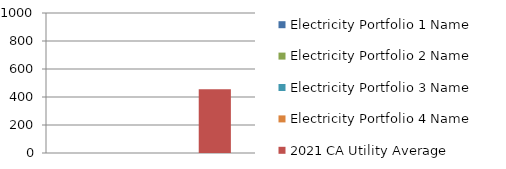
| Category | Electricity Portfolio 1 Name | Electricity Portfolio 2 Name | Electricity Portfolio 3 Name | Electricity Portfolio 4 Name | 2021 CA Utility Average |
|---|---|---|---|---|---|
| 0 | 0 | 0 | 0 | 0 | 456 |